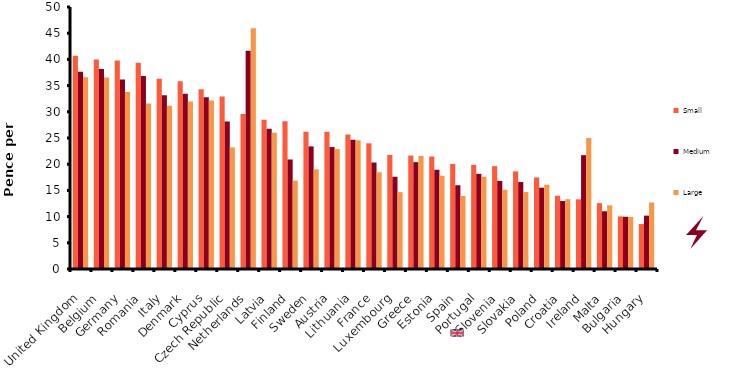
| Category | Small | Medium | Large |
|---|---|---|---|
| United Kingdom | 40.698 | 37.666 | 36.585 |
| Belgium | 39.986 | 38.153 | 36.557 |
| Germany | 39.785 | 36.18 | 33.768 |
| Romania | 39.373 | 36.829 | 31.584 |
| Italy | 36.285 | 33.172 | 31.163 |
| Denmark | 35.838 | 33.426 | 31.987 |
| Cyprus | 34.285 | 32.794 | 32.163 |
| Czech Republic | 32.9 | 28.172 | 23.208 |
| Netherlands | 29.593 | 41.662 | 45.968 |
| Latvia | 28.479 | 26.786 | 25.997 |
| Finland | 28.207 | 20.901 | 16.875 |
| Sweden | 26.207 | 23.401 | 19.024 |
| Austria | 26.207 | 23.269 | 22.883 |
| Lithuania | 25.672 | 24.664 | 24.55 |
| France | 23.988 | 20.322 | 18.454 |
| Luxembourg | 21.761 | 17.612 | 14.674 |
| Greece | 21.647 | 20.392 | 21.568 |
| Estonia | 21.462 | 18.945 | 17.787 |
| Spain | 20.05 | 15.989 | 13.937 |
| Portugal | 19.857 | 18.165 | 17.586 |
| Slovenia | 19.629 | 16.814 | 15.112 |
| Slovakia | 18.629 | 16.595 | 14.682 |
| Poland | 17.472 | 15.516 | 16.095 |
| Croatia | 13.99 | 12.981 | 13.314 |
| Ireland | 13.288 | 21.726 | 25.015 |
| Malta | 12.569 | 11.016 | 12.148 |
| Bulgaria | 10.043 | 9.973 | 9.929 |
| Hungary | 8.578 | 10.183 | 12.7 |